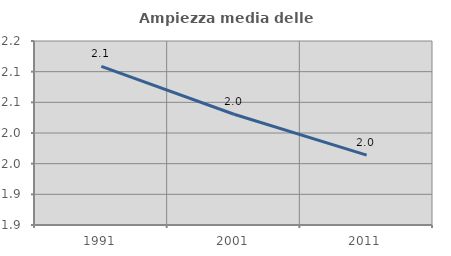
| Category | Ampiezza media delle famiglie |
|---|---|
| 1991.0 | 2.109 |
| 2001.0 | 2.031 |
| 2011.0 | 1.964 |